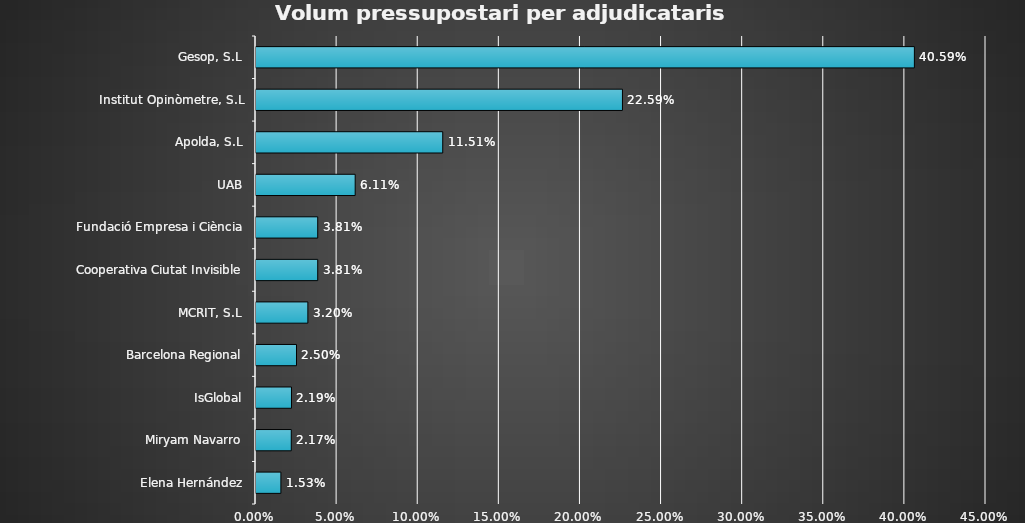
| Category | Series 0 |
|---|---|
| Elena Hernández | 0.015 |
| Miryam Navarro | 0.022 |
| IsGlobal | 0.022 |
| Barcelona Regional | 0.025 |
| MCRIT, S.L | 0.032 |
| Cooperativa Ciutat Invisible | 0.038 |
| Fundació Empresa i Ciència | 0.038 |
| UAB | 0.061 |
| Apolda, S.L | 0.115 |
| Institut Opinòmetre, S.L | 0.226 |
| Gesop, S.L | 0.406 |